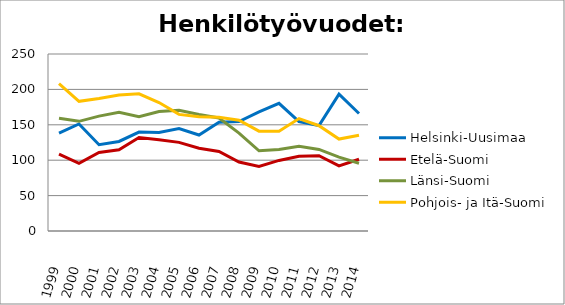
| Category | Helsinki-Uusimaa | Etelä-Suomi | Länsi-Suomi | Pohjois- ja Itä-Suomi |
|---|---|---|---|---|
| 1999.0 | 138.4 | 108.7 | 159.3 | 208 |
| 2000.0 | 151.2 | 95.7 | 154.9 | 183.2 |
| 2001.0 | 121.8 | 111 | 162.23 | 187.17 |
| 2002.0 | 126.46 | 114.82 | 167.56 | 192.02 |
| 2003.0 | 139.73 | 132.14 | 161.37 | 193.7 |
| 2004.0 | 139.11 | 128.9 | 168.84 | 181.43 |
| 2005.0 | 144.69 | 125.21 | 170.65 | 164.71 |
| 2006.0 | 135.56 | 116.98 | 164.43 | 161.32 |
| 2007.0 | 153.45 | 112.41 | 159.56 | 160.5 |
| 2008.0 | 154.51 | 97.36 | 138.34 | 156.48 |
| 2009.0 | 168.25 | 91.03 | 113.27 | 140.99 |
| 2010.0 | 180.32 | 99.7 | 114.98 | 141.01 |
| 2011.0 | 154.49 | 105.42 | 119.84 | 158.79 |
| 2012.0 | 148.79 | 106.29 | 115.24 | 148.7 |
| 2013.0 | 193.23 | 92.09 | 104.32 | 129.87 |
| 2014.0 | 166.02 | 101.38 | 95.75 | 135.37 |